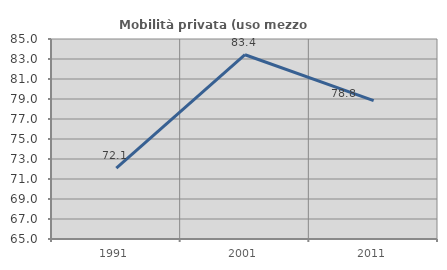
| Category | Mobilità privata (uso mezzo privato) |
|---|---|
| 1991.0 | 72.078 |
| 2001.0 | 83.425 |
| 2011.0 | 78.846 |